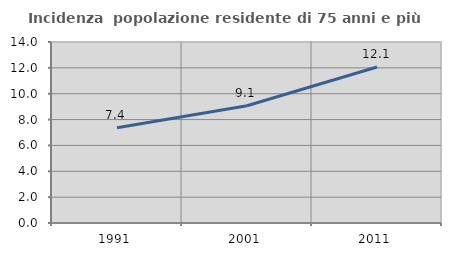
| Category | Incidenza  popolazione residente di 75 anni e più |
|---|---|
| 1991.0 | 7.365 |
| 2001.0 | 9.074 |
| 2011.0 | 12.066 |